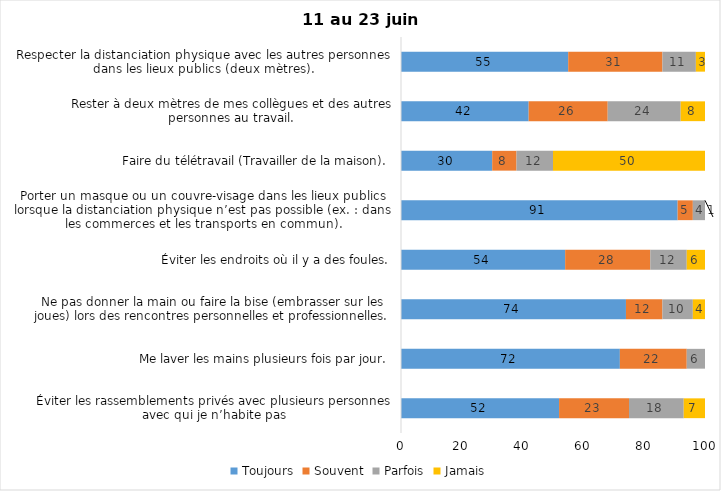
| Category | Toujours | Souvent | Parfois | Jamais |
|---|---|---|---|---|
| Éviter les rassemblements privés avec plusieurs personnes avec qui je n’habite pas | 52 | 23 | 18 | 7 |
| Me laver les mains plusieurs fois par jour. | 72 | 22 | 6 | 0 |
| Ne pas donner la main ou faire la bise (embrasser sur les joues) lors des rencontres personnelles et professionnelles. | 74 | 12 | 10 | 4 |
| Éviter les endroits où il y a des foules. | 54 | 28 | 12 | 6 |
| Porter un masque ou un couvre-visage dans les lieux publics lorsque la distanciation physique n’est pas possible (ex. : dans les commerces et les transports en commun). | 91 | 5 | 4 | 1 |
| Faire du télétravail (Travailler de la maison). | 30 | 8 | 12 | 50 |
| Rester à deux mètres de mes collègues et des autres personnes au travail. | 42 | 26 | 24 | 8 |
| Respecter la distanciation physique avec les autres personnes dans les lieux publics (deux mètres). | 55 | 31 | 11 | 3 |